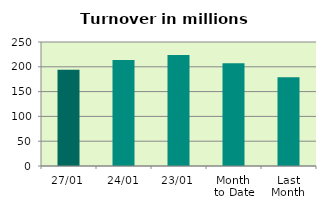
| Category | Series 0 |
|---|---|
| 27/01 | 194.143 |
| 24/01 | 213.89 |
| 23/01 | 223.965 |
| Month 
to Date | 207.164 |
| Last
Month | 179.047 |